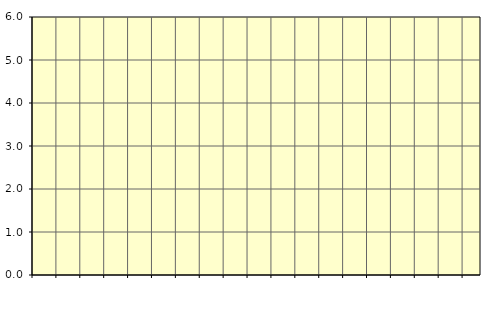
| Category | Piggar | Transport, SNI 49-53 |
|---|---|---|
| nan | 8.1 | 8.05 |
| 1.0 | 7.9 | 7.96 |
| 1.0 | 7.9 | 7.86 |
| 1.0 | 7.7 | 7.79 |
| nan | 7.8 | 7.79 |
| 2.0 | 7.9 | 7.83 |
| 2.0 | 7.8 | 7.87 |
| 2.0 | 8 | 7.87 |
| nan | 7.8 | 7.8 |
| 3.0 | 7.8 | 7.69 |
| 3.0 | 7.5 | 7.59 |
| 3.0 | 7.6 | 7.49 |
| nan | 7.4 | 7.41 |
| 4.0 | 7.3 | 7.33 |
| 4.0 | 7.4 | 7.24 |
| 4.0 | 7 | 7.19 |
| nan | 7.2 | 7.23 |
| 5.0 | 7.3 | 7.33 |
| 5.0 | 7.5 | 7.4 |
| 5.0 | 7.4 | 7.43 |
| nan | 7.5 | 7.43 |
| 6.0 | 7.4 | 7.46 |
| 6.0 | 7.4 | 7.52 |
| 6.0 | 7.6 | 7.58 |
| nan | 7.5 | 7.62 |
| 7.0 | 7.7 | 7.65 |
| 7.0 | 7.7 | 7.72 |
| 7.0 | 7.8 | 7.74 |
| nan | 7.7 | 7.68 |
| 8.0 | 7.5 | 7.54 |
| 8.0 | 7.5 | 7.4 |
| 8.0 | 7.2 | 7.3 |
| nan | 7.2 | 7.25 |
| 9.0 | 7.2 | 7.25 |
| 9.0 | 7.4 | 7.3 |
| 9.0 | 7.4 | 7.42 |
| nan | 7.7 | 7.58 |
| 10.0 | 7.8 | 7.71 |
| 10.0 | 7.7 | 7.79 |
| 10.0 | 7.9 | 7.8 |
| nan | 7.8 | 7.74 |
| 11.0 | 7.6 | 7.63 |
| 11.0 | 7.5 | 7.53 |
| 11.0 | 7.5 | 7.49 |
| nan | 7.4 | 7.47 |
| 12.0 | 7.5 | 7.45 |
| 12.0 | 7.4 | 7.47 |
| 12.0 | 7.5 | 7.54 |
| nan | 7.6 | 7.66 |
| 13.0 | 7.8 | 7.75 |
| 13.0 | 7.7 | 7.75 |
| 13.0 | 7.7 | 7.71 |
| nan | 7.7 | 7.7 |
| 14.0 | 7.6 | 7.77 |
| 14.0 | 8 | 7.81 |
| 14.0 | 7.6 | 7.76 |
| nan | 7.7 | 7.68 |
| 15.0 | 7.6 | 7.64 |
| 15.0 | 7.7 | 7.63 |
| 15.0 | 7.6 | 7.61 |
| nan | 7.6 | 7.58 |
| 16.0 | 7.7 | 7.59 |
| 16.0 | 7.6 | 7.62 |
| 16.0 | 7.8 | 7.7 |
| nan | 7.7 | 7.77 |
| 17.0 | 7.8 | 7.81 |
| 17.0 | 7.8 | 7.83 |
| 17.0 | 7.8 | 7.86 |
| nan | 7.9 | 7.84 |
| 18.0 | 7.9 | 7.74 |
| 18.0 | 7.5 | 7.66 |
| 18.0 | 7.9 | 7.66 |
| nan | 7.8 | 7.78 |
| 19.0 | 7.7 | 7.94 |
| 19.0 | 8.2 | 8.06 |